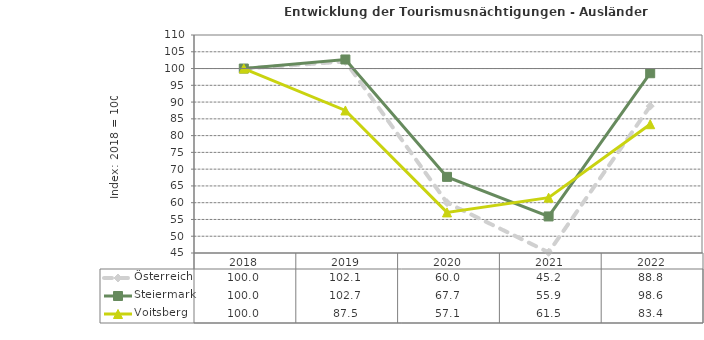
| Category | Österreich | Steiermark | Voitsberg |
|---|---|---|---|
| 2022.0 | 88.8 | 98.6 | 83.4 |
| 2021.0 | 45.2 | 55.9 | 61.5 |
| 2020.0 | 60 | 67.7 | 57.1 |
| 2019.0 | 102.1 | 102.7 | 87.5 |
| 2018.0 | 100 | 100 | 100 |